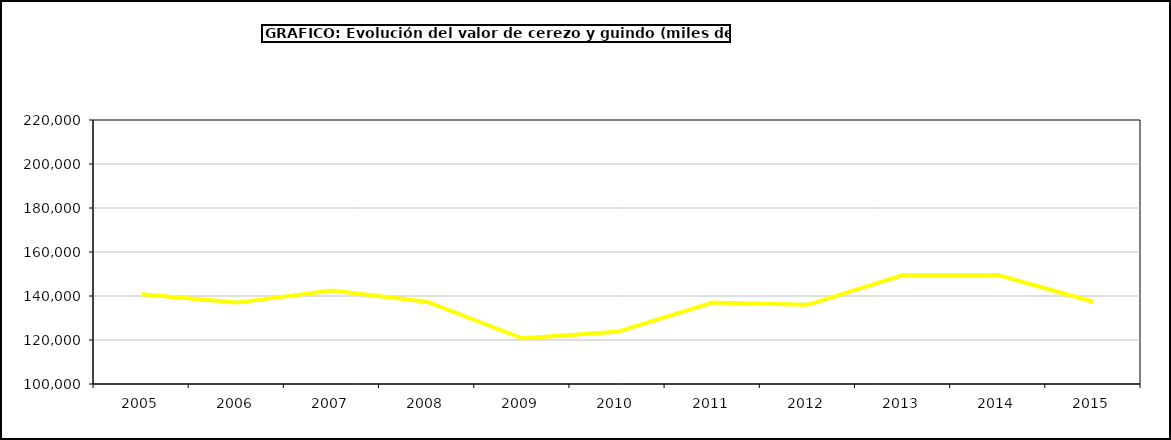
| Category | valor cerezo y guindo |
|---|---|
| 2005.0 | 140784.228 |
| 2006.0 | 136994.637 |
| 2007.0 | 142440.457 |
| 2008.0 | 137384.834 |
| 2009.0 | 120767.336 |
| 2010.0 | 123711.92 |
| 2011.0 | 137034.469 |
| 2012.0 | 136005.543 |
| 2013.0 | 149538.377 |
| 2014.0 | 149493.495 |
| 2015.0 | 137364 |